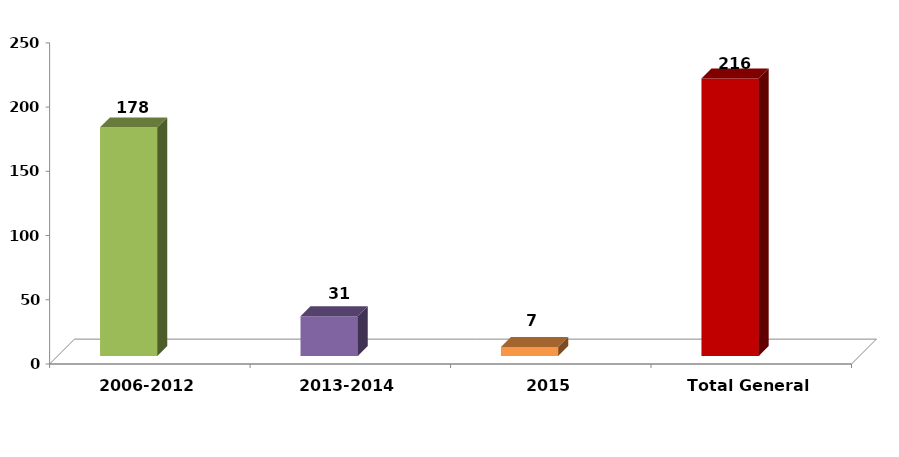
| Category | Series 1 | Series 2 |
|---|---|---|
| 2006-2012 | 178 |  |
| 2013-2014 | 31 |  |
| 2015 | 7 |  |
| Total General | 216 |  |